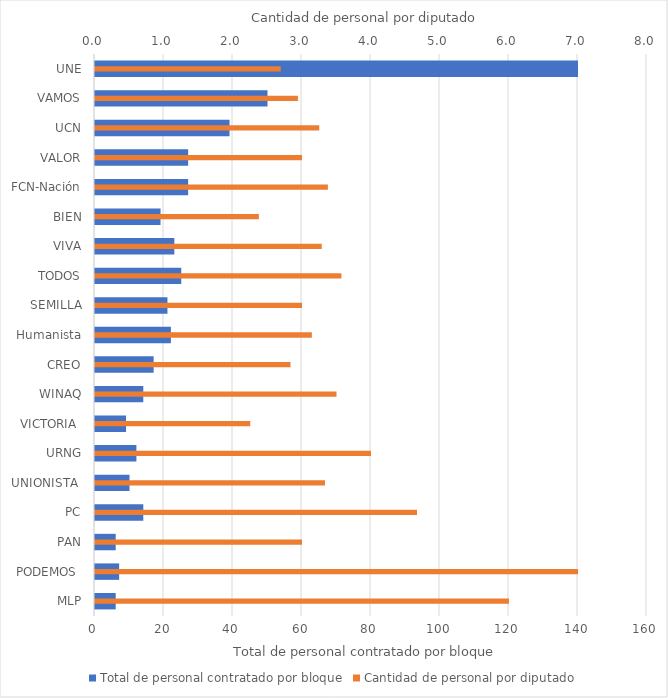
| Category | Total de personal contratado por bloque |
|---|---|
| MLP | 6 |
| PODEMOS  | 7 |
| PAN | 6 |
| PC | 14 |
| UNIONISTA  | 10 |
| URNG | 12 |
| VICTORIA  | 9 |
| WINAQ | 14 |
| CREO | 17 |
| Humanista | 22 |
| SEMILLA | 21 |
| TODOS | 25 |
| VIVA | 23 |
| BIEN | 19 |
| FCN-Nación | 27 |
| VALOR | 27 |
| UCN | 39 |
| VAMOS | 50 |
| UNE | 140 |